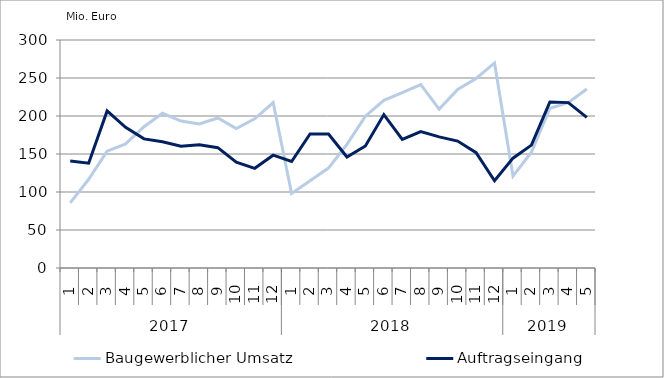
| Category | Baugewerblicher Umsatz | Auftragseingang |
|---|---|---|
| 0 | 85701.947 | 140751.008 |
| 1 | 116743.276 | 137863.383 |
| 2 | 153810.055 | 206710.579 |
| 3 | 163342.989 | 185183.797 |
| 4 | 185946.221 | 169878.51 |
| 5 | 203627.91 | 166148.392 |
| 6 | 193377.256 | 160134.206 |
| 7 | 189429.952 | 162221.206 |
| 8 | 197405.279 | 158305.285 |
| 9 | 183450.026 | 139156.761 |
| 10 | 196209.214 | 131165.419 |
| 11 | 217688.447 | 148434.901 |
| 12 | 97959.056 | 140119.385 |
| 13 | 114756.787 | 176330.213 |
| 14 | 131454.642 | 176241.061 |
| 15 | 162648.053 | 146063.407 |
| 16 | 199809.407 | 160551.931 |
| 17 | 220535.974 | 201835.846 |
| 18 | 230672.472 | 169132.23 |
| 19 | 241233.619 | 179396.293 |
| 20 | 209099.292 | 172542.764 |
| 21 | 234953.007 | 166991.729 |
| 22 | 249410.043 | 151835.629 |
| 23 | 269773.227 | 114807.456 |
| 24 | 120975.133 | 144510.881 |
| 25 | 152329.786 | 161685.201 |
| 26 | 210227.67 | 218455.879 |
| 27 | 217522.321 | 217610.064 |
| 28 | 235490.429 | 198110.439 |